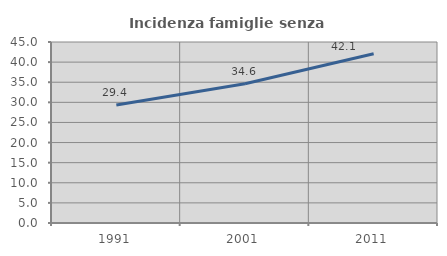
| Category | Incidenza famiglie senza nuclei |
|---|---|
| 1991.0 | 29.355 |
| 2001.0 | 34.601 |
| 2011.0 | 42.069 |